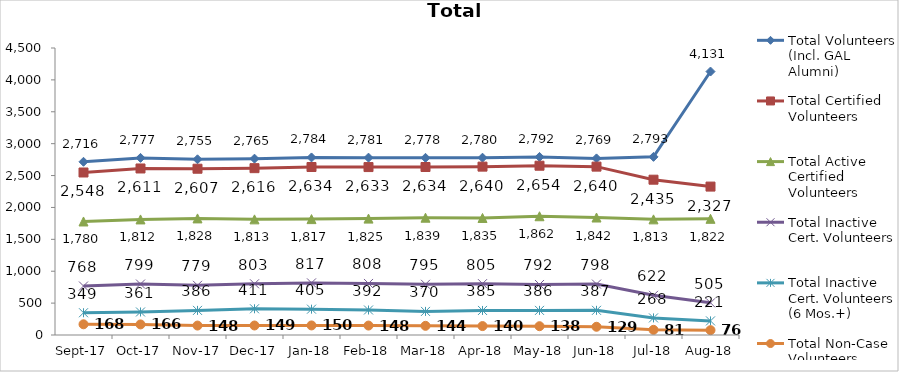
| Category | Total Volunteers (Incl. GAL Alumni) | Total Certified Volunteers | Total Active Certified Volunteers | Total Inactive Cert. Volunteers | Total Inactive Cert. Volunteers (6 Mos.+) | Total Non-Case Volunteers |
|---|---|---|---|---|---|---|
| 2017-09-01 | 2716 | 2548 | 1780 | 768 | 349 | 168 |
| 2017-10-01 | 2777 | 2611 | 1812 | 799 | 361 | 166 |
| 2017-11-01 | 2755 | 2607 | 1828 | 779 | 386 | 148 |
| 2017-12-01 | 2765 | 2616 | 1813 | 803 | 411 | 149 |
| 2018-01-01 | 2784 | 2634 | 1817 | 817 | 405 | 150 |
| 2018-02-01 | 2781 | 2633 | 1825 | 808 | 392 | 148 |
| 2018-03-01 | 2778 | 2634 | 1839 | 795 | 370 | 144 |
| 2018-04-01 | 2780 | 2640 | 1835 | 805 | 385 | 140 |
| 2018-05-01 | 2792 | 2654 | 1862 | 792 | 386 | 138 |
| 2018-06-01 | 2769 | 2640 | 1842 | 798 | 387 | 129 |
| 2018-07-01 | 2793 | 2435 | 1813 | 622 | 268 | 81 |
| 2018-08-01 | 4131 | 2327 | 1822 | 505 | 221 | 76 |